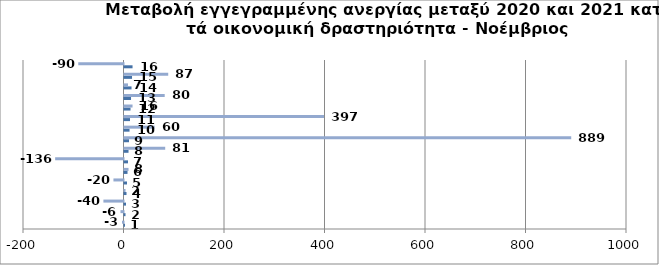
| Category | Series 0 | Series 1 |
|---|---|---|
| 0 | 1 | -3 |
| 1 | 2 | -6 |
| 2 | 3 | -40 |
| 3 | 4 | 2 |
| 4 | 5 | -20 |
| 5 | 6 | 8 |
| 6 | 7 | -136 |
| 7 | 8 | 81 |
| 8 | 9 | 889 |
| 9 | 10 | 60 |
| 10 | 11 | 397 |
| 11 | 12 | 16 |
| 12 | 13 | 80 |
| 13 | 14 | 7 |
| 14 | 15 | 87 |
| 15 | 16 | -90 |